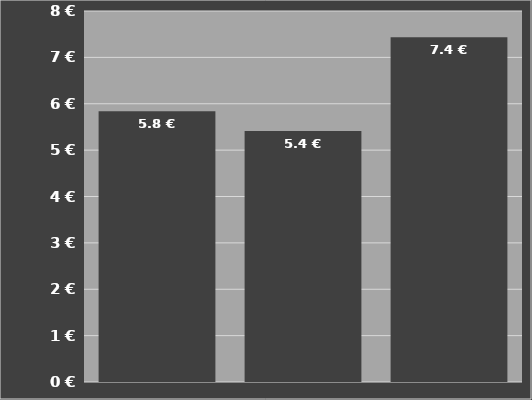
| Category | Kosten je Hektar
inklusive Schlepper |
|---|---|
| Anbauspritze | 5.837 |
| Gezogene Spritze | 5.414 |
| Selbstfahrer plus Spritzgestänge | 7.432 |